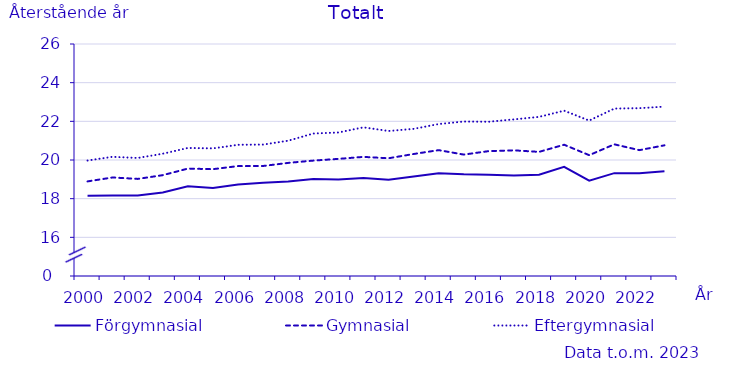
| Category | Förgymnasial | Gymnasial | Eftergymnasial |
|---|---|---|---|
| 2000.0 | 18.146 | 18.893 | 19.974 |
| 2001.0 | 18.158 | 19.096 | 20.164 |
| 2002.0 | 18.167 | 19.022 | 20.105 |
| 2003.0 | 18.318 | 19.216 | 20.325 |
| 2004.0 | 18.646 | 19.555 | 20.623 |
| 2005.0 | 18.552 | 19.526 | 20.6 |
| 2006.0 | 18.73 | 19.685 | 20.787 |
| 2007.0 | 18.817 | 19.691 | 20.798 |
| 2008.0 | 18.885 | 19.85 | 20.999 |
| 2009.0 | 19.016 | 19.969 | 21.369 |
| 2010.0 | 18.989 | 20.058 | 21.422 |
| 2011.0 | 19.066 | 20.161 | 21.69 |
| 2012.0 | 18.98 | 20.09 | 21.5 |
| 2013.0 | 19.15 | 20.31 | 21.61 |
| 2014.0 | 19.31 | 20.51 | 21.86 |
| 2015.0 | 19.26 | 20.28 | 21.99 |
| 2016.0 | 19.24 | 20.46 | 21.98 |
| 2017.0 | 19.2 | 20.5 | 22.1 |
| 2018.0 | 19.24 | 20.42 | 22.23 |
| 2019.0 | 19.65 | 20.79 | 22.55 |
| 2020.0 | 18.93 | 20.25 | 22.04 |
| 2021.0 | 19.32 | 20.81 | 22.66 |
| 2022.0 | 19.32 | 20.51 | 22.68 |
| 2023.0 | 19.42 | 20.76 | 22.76 |